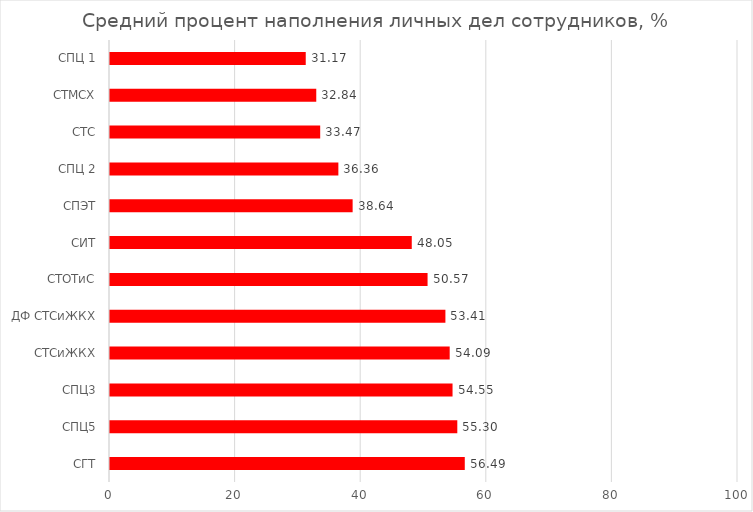
| Category | Series 0 |
|---|---|
| СГТ | 56.494 |
| СПЦ5 | 55.303 |
| СПЦ3 | 54.545 |
| СТСиЖКХ | 54.091 |
| ДФ СТСиЖКХ | 53.409 |
| СТОТиС | 50.568 |
| СИТ | 48.052 |
| СПЭТ | 38.636 |
| СПЦ 2 | 36.364 |
| СТС | 33.471 |
| СТМСХ | 32.845 |
| СПЦ 1 | 31.169 |